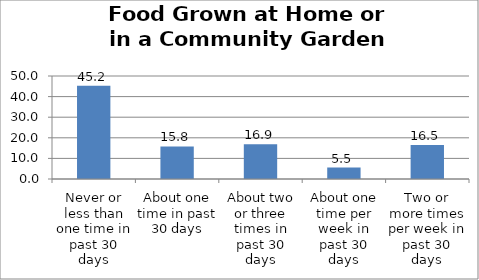
| Category | Series 0 |
|---|---|
| Never or less than one time in past 30 days | 45.244 |
| About one time in past 30 days | 15.816 |
| About two or three times in past 30 days | 16.88 |
| About one time per week in past 30 days | 5.543 |
| Two or more times per week in past 30 days | 16.518 |